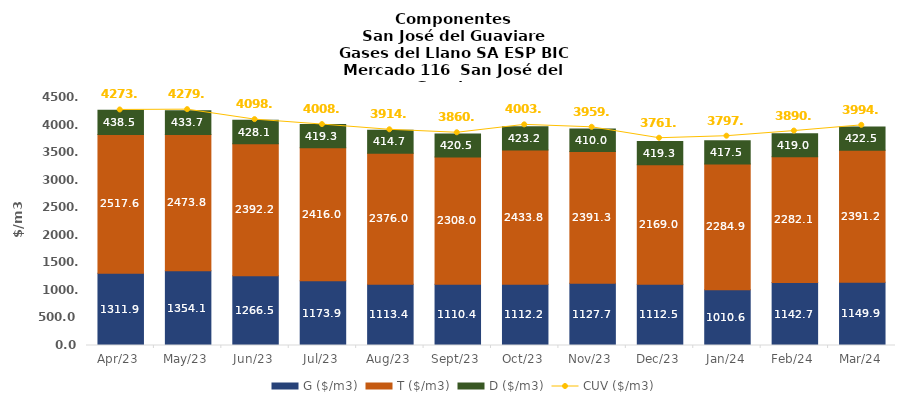
| Category | G ($/m3) | T ($/m3) | D ($/m3) |
|---|---|---|---|
| 2023-04-01 | 1311.89 | 2517.58 | 438.54 |
| 2023-05-01 | 1354.14 | 2473.76 | 433.72 |
| 2023-06-01 | 1266.52 | 2392.24 | 428.13 |
| 2023-07-01 | 1173.91 | 2415.98 | 419.29 |
| 2023-08-01 | 1113.38 | 2375.96 | 414.65 |
| 2023-09-01 | 1110.42 | 2307.98 | 420.53 |
| 2023-10-01 | 1112.24 | 2433.8 | 423.16 |
| 2023-11-01 | 1127.7 | 2391.33 | 410 |
| 2023-12-01 | 1112.49 | 2169.04 | 419.27 |
| 2024-01-01 | 1010.63 | 2284.85 | 417.54 |
| 2024-02-01 | 1142.71 | 2282.13 | 419.04 |
| 2024-03-01 | 1149.94 | 2391.22 | 422.47 |